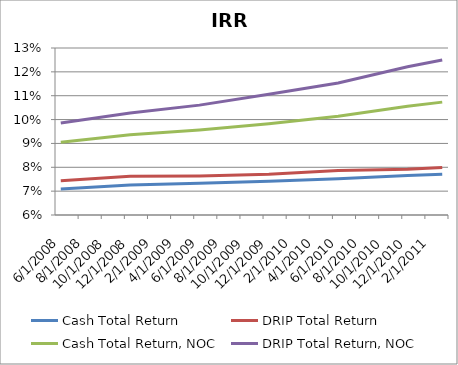
| Category | Cash Total Return | DRIP Total Return | Cash Total Return, NOC | DRIP Total Return, NOC |
|---|---|---|---|---|
| 6/24/08 | 0.071 | 0.074 | 0.091 | 0.099 |
| 12/31/08 | 0.073 | 0.076 | 0.094 | 0.103 |
| 6/30/09 | 0.073 | 0.076 | 0.096 | 0.106 |
| 12/31/09 | 0.074 | 0.077 | 0.098 | 0.111 |
| 6/30/10 | 0.075 | 0.079 | 0.101 | 0.115 |
| 12/31/10 | 0.077 | 0.079 | 0.106 | 0.122 |
| 3/2/11 | 0.077 | 0.08 | 0.107 | 0.125 |